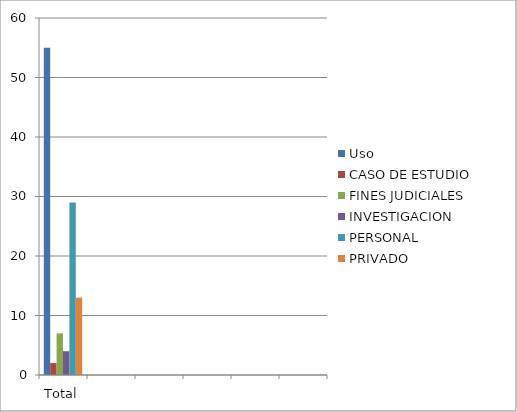
| Category | Uso | CASO DE ESTUDIO | FINES JUDICIALES | INVESTIGACION | PERSONAL | PRIVADO |
|---|---|---|---|---|---|---|
| Total | 55 | 2 | 7 | 4 | 29 | 13 |